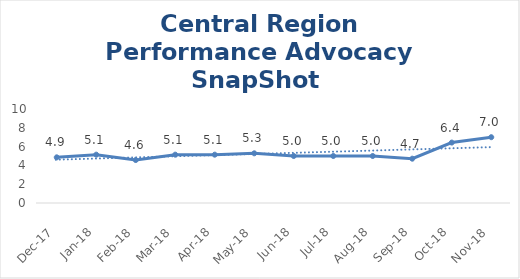
| Category | Central Region |
|---|---|
| Dec-17 | 4.857 |
| Jan-18 | 5.143 |
| Feb-18 | 4.571 |
| Mar-18 | 5.143 |
| Apr-18 | 5.143 |
| May-18 | 5.286 |
| Jun-18 | 5 |
| Jul-18 | 5 |
| Aug-18 | 5 |
| Sep-18 | 4.714 |
| Oct-18 | 6.429 |
| Nov-18 | 7 |